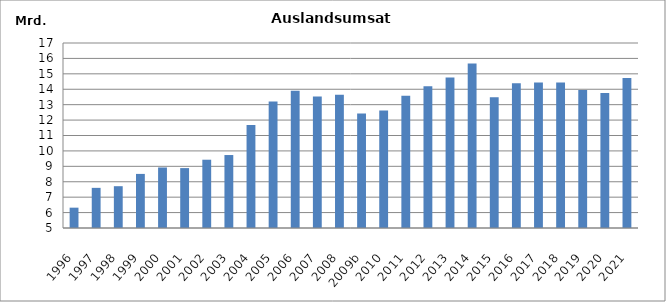
| Category | Series 0 |
|---|---|
| 1996 | 6319142 |
| 1997 | 7603819 |
| 1998 | 7711587 |
| 1999 | 8508603 |
| 2000 | 8925754 |
| 2001 | 8885463 |
| 2002 | 9428713 |
| 2003 | 9733339 |
| 2004 | 11680546 |
| 2005 | 13208153 |
| 2006 | 13901521 |
| 2007 | 13537187 |
| 2008 | 13649884 |
| 2009b | 12432618 |
| 2010 | 12628416.402 |
| 2011 | 13577795 |
| 2012 | 14199097 |
| 2013 | 14765099 |
| 2014 | 15677925.464 |
| 2015 | 13486756 |
| 2016 | 14385658 |
| 2017 | 14436506 |
| 2018 | 14434940 |
| 2019 | 13955245 |
| 2020 | 13761427 |
| 2021 | 14734266.581 |